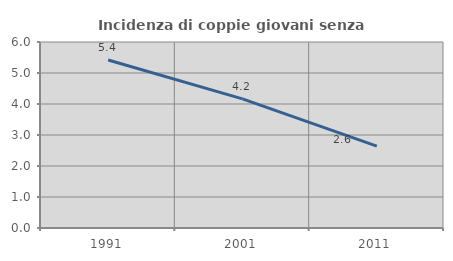
| Category | Incidenza di coppie giovani senza figli |
|---|---|
| 1991.0 | 5.42 |
| 2001.0 | 4.167 |
| 2011.0 | 2.639 |